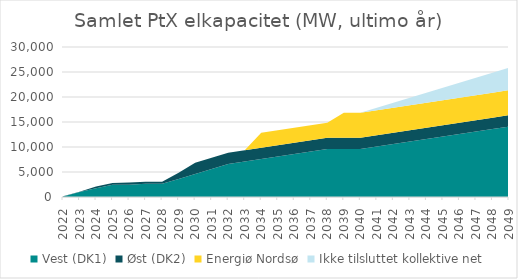
| Category | Vest (DK1) | Øst (DK2) | Energiø Nordsø | Ikke tilsluttet kollektive net |
|---|---|---|---|---|
| 2022.0 | 116 | 10 | 0 | 0 |
| 2023.0 | 1022 | 30 | 0 | 0 |
| 2024.0 | 1762.5 | 327 | 0 | 0 |
| 2025.0 | 2450.5 | 327 | 0 | 0 |
| 2026.0 | 2450.5 | 447 | 0 | 0 |
| 2027.0 | 2625.5 | 447 | 0 | 0 |
| 2028.0 | 2625.5 | 447 | 0 | 0 |
| 2029.0 | 3587 | 1287 | 0 | 0 |
| 2030.0 | 4587 | 2287 | 0 | 0 |
| 2031.0 | 5587 | 2287 | 0 | 0 |
| 2032.0 | 6587 | 2287 | 0 | 0 |
| 2033.0 | 7087 | 2287 | 0 | 0 |
| 2034.0 | 7587 | 2287 | 3000 | 0 |
| 2035.0 | 8087 | 2287 | 3000 | 0 |
| 2036.0 | 8587 | 2287 | 3000 | 0 |
| 2037.0 | 9087 | 2287 | 3000 | 0 |
| 2038.0 | 9587 | 2287 | 3000 | 0 |
| 2039.0 | 9587 | 2287 | 5000 | 0 |
| 2040.0 | 9587 | 2287 | 5000 | 0 |
| 2041.0 | 10087 | 2287 | 5000 | 500 |
| 2042.0 | 10587 | 2287 | 5000 | 1000 |
| 2043.0 | 11087 | 2287 | 5000 | 1500 |
| 2044.0 | 11587 | 2287 | 5000 | 2000 |
| 2045.0 | 12087 | 2287 | 5000 | 2500 |
| 2046.0 | 12587 | 2287 | 5000 | 3000 |
| 2047.0 | 13087 | 2287 | 5000 | 3500 |
| 2048.0 | 13587 | 2287 | 5000 | 4000 |
| 2049.0 | 14087 | 2287 | 5000 | 4500 |